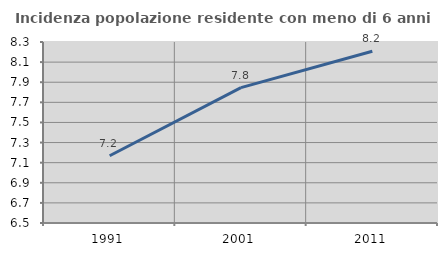
| Category | Incidenza popolazione residente con meno di 6 anni |
|---|---|
| 1991.0 | 7.169 |
| 2001.0 | 7.846 |
| 2011.0 | 8.208 |